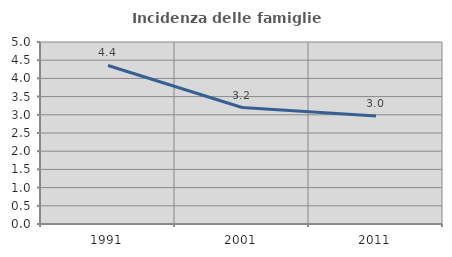
| Category | Incidenza delle famiglie numerose |
|---|---|
| 1991.0 | 4.355 |
| 2001.0 | 3.2 |
| 2011.0 | 2.97 |